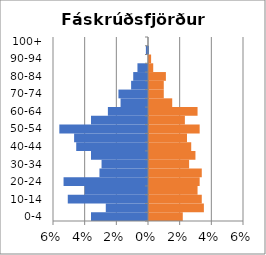
| Category | % Men | % Women |
|---|---|---|
| 0-4 | -0.036 | 0.021 |
| 5-9 | -0.027 | 0.035 |
| 10-14 | -0.051 | 0.033 |
| 15-19 | -0.04 | 0.031 |
| 20-24 | -0.053 | 0.032 |
| 25-29 | -0.031 | 0.033 |
| 30-34 | -0.029 | 0.025 |
| 35-39 | -0.036 | 0.029 |
| 40-44 | -0.045 | 0.027 |
| 45-49 | -0.047 | 0.024 |
| 50-54 | -0.056 | 0.032 |
| 55-59 | -0.036 | 0.023 |
| 60-64 | -0.025 | 0.031 |
| 65-69 | -0.017 | 0.015 |
| 70-74 | -0.019 | 0.009 |
| 75-79 | -0.011 | 0.009 |
| 80-84 | -0.009 | 0.011 |
| 85-89 | -0.007 | 0.003 |
| 90-94 | 0 | 0.001 |
| 95-99 | -0.001 | 0 |
| 100+ | 0 | 0 |